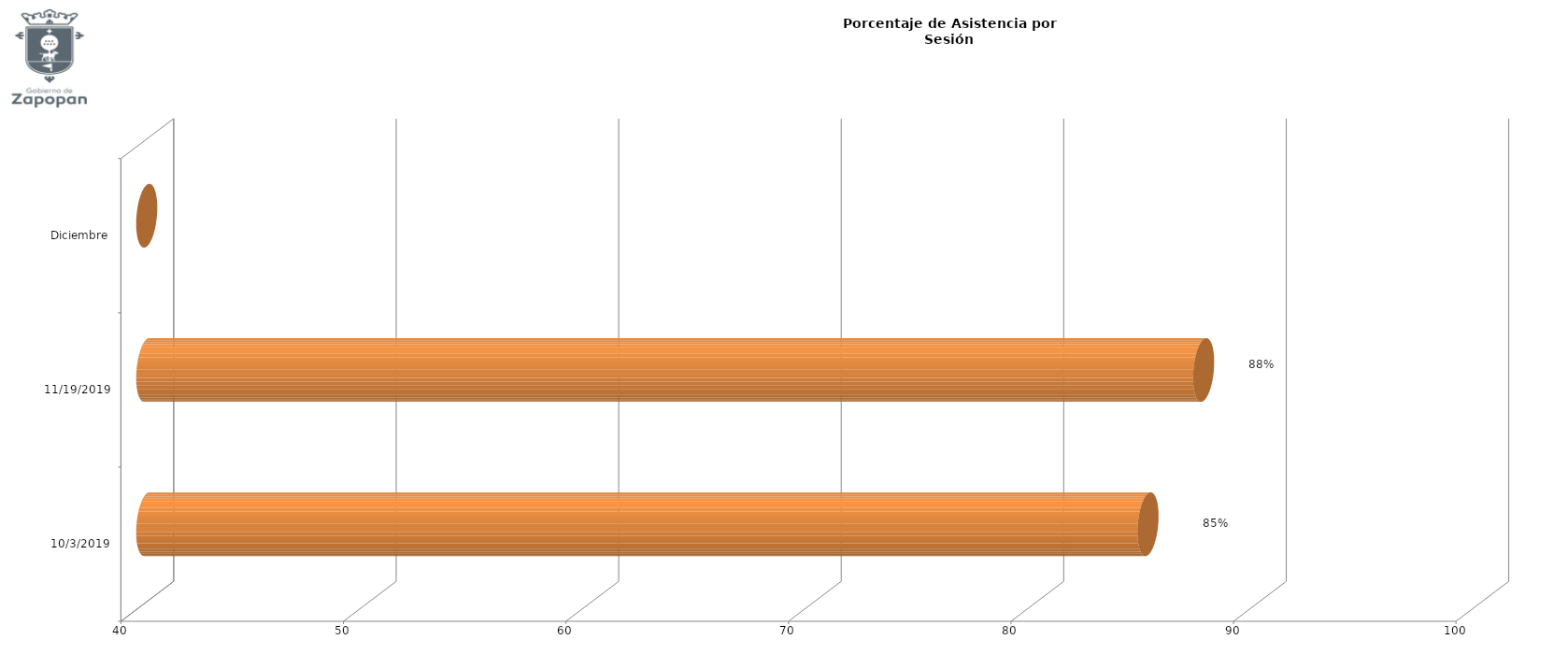
| Category | Series 0 |
|---|---|
| 03/10/2019 | 85 |
| 19/11/2019 | 87.5 |
| Diciembre | 0 |